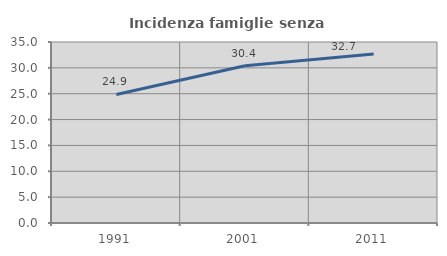
| Category | Incidenza famiglie senza nuclei |
|---|---|
| 1991.0 | 24.852 |
| 2001.0 | 30.423 |
| 2011.0 | 32.698 |